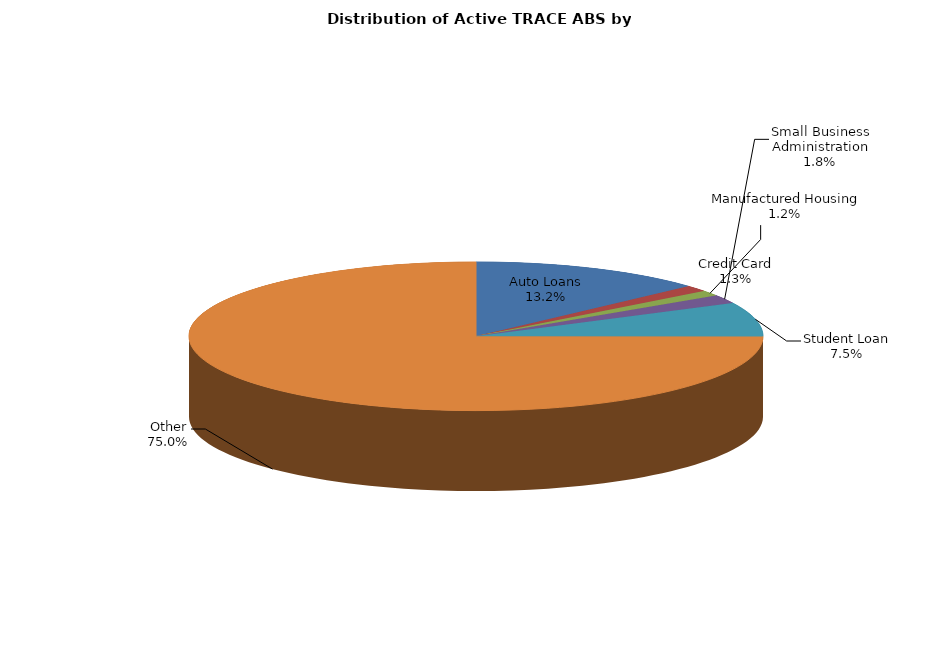
| Category | Series 0 |
|---|---|
| Auto Loans | 2573 |
| Credit Card | 262 |
| Manufactured Housing | 231 |
| Small Business Administration | 354 |
| Student Loan | 1451 |
| Other | 14577 |